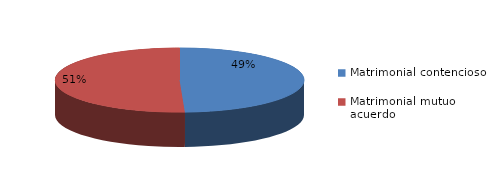
| Category | Series 0 |
|---|---|
| 0 | 364 |
| 1 | 374 |